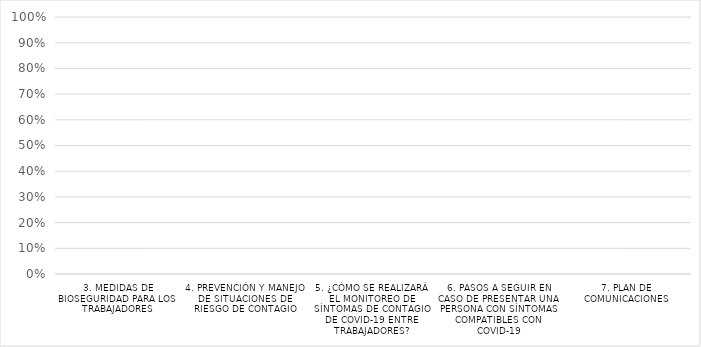
| Category | Series 0 |
|---|---|
| 3. MEDIDAS DE BIOSEGURIDAD PARA LOS TRABAJADORES | 0 |
| 4. PREVENCIÓN Y MANEJO DE SITUACIONES DE RIESGO DE CONTAGIO | 0 |
| 5. ¿CÓMO SE REALIZARÁ EL MONITOREO DE SÍNTOMAS DE CONTAGIO DE COVID-19 ENTRE TRABAJADORES? | 0 |
| 6. PASOS A SEGUIR EN CASO DE PRESENTAR UNA PERSONA CON SÍNTOMAS COMPATIBLES CON COVID-19 | 0 |
| 7. PLAN DE COMUNICACIONES | 0 |